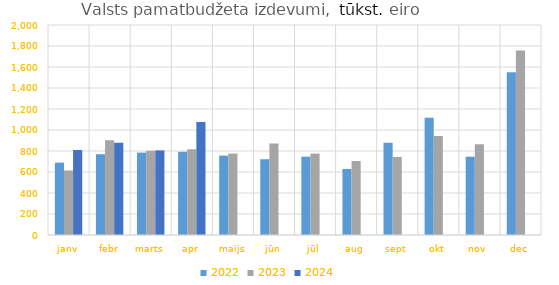
| Category | 2022 | 2023 | 2024 |
|---|---|---|---|
| janv | 689237.965 | 614585.632 | 809894.408 |
| febr | 769410.975 | 903091.852 | 879752.527 |
| marts | 784728.56 | 801670.588 | 805671.926 |
| apr | 792151.693 | 815830.901 | 1076388.251 |
| maijs | 756370.204 | 775435.197 | 0 |
| jūn | 721608.297 | 872192.844 | 0 |
| jūl | 745948.556 | 775102.307 | 0 |
| aug | 628998.795 | 704584.156 | 0 |
| sept | 879428.128 | 743373.689 | 0 |
| okt | 1117520.592 | 943256.707 | 0 |
| nov | 745480.917 | 864698.939 | 0 |
| dec | 1550280.295 | 1757604.888 | 0 |